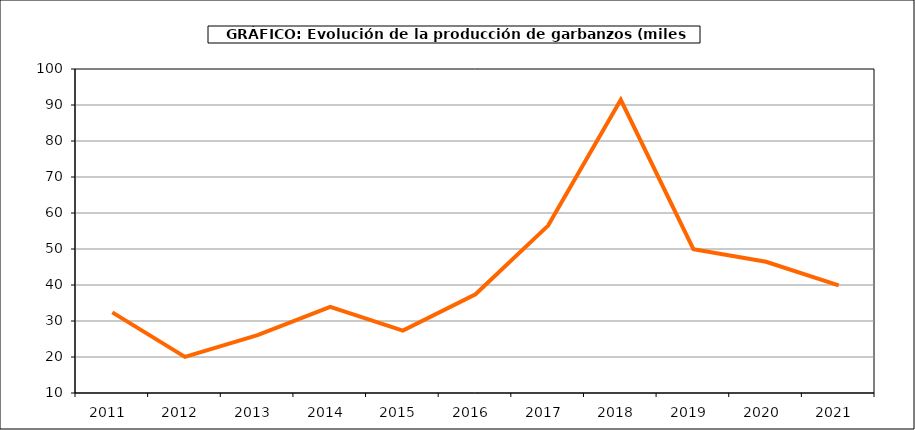
| Category | Superficie |
|---|---|
| 2011.0 | 32.408 |
| 2012.0 | 20.03 |
| 2013.0 | 26.073 |
| 2014.0 | 33.954 |
| 2015.0 | 27.348 |
| 2016.0 | 37.42 |
| 2017.0 | 56.498 |
| 2018.0 | 91.456 |
| 2019.0 | 49.971 |
| 2020.0 | 46.454 |
| 2021.0 | 39.914 |